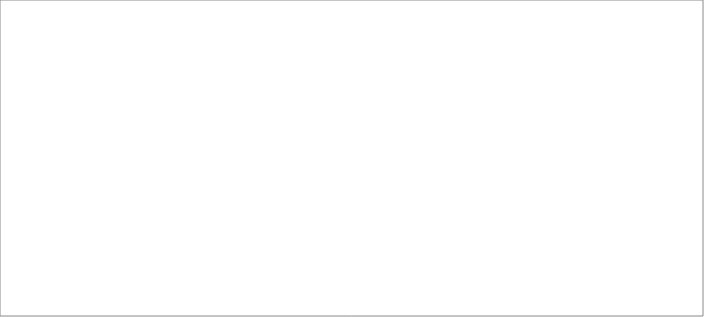
| Category | PreB | PostB |
|---|---|---|
| 0 | 1 | 1 |